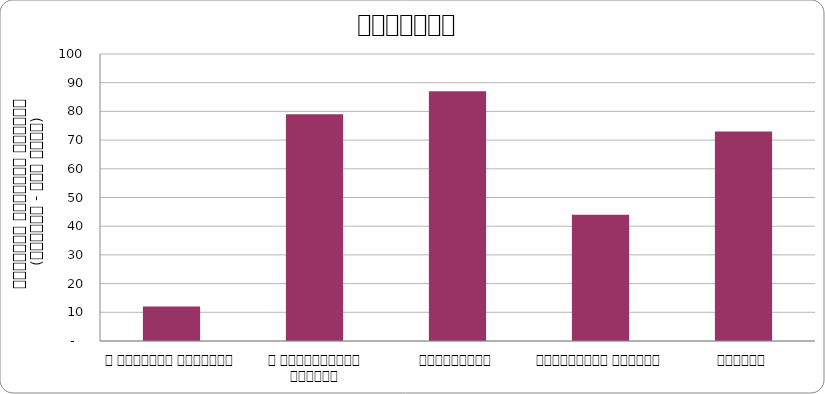
| Category | राजनीति |
|---|---|
| द हिमालयन टाइम्स् | 12 |
| द काठमाण्डौं पोस्ट् | 79 |
| कान्तिपुर | 87 |
| अन्नपूर्ण पोस्ट् | 44 |
| नागरिक | 73 |